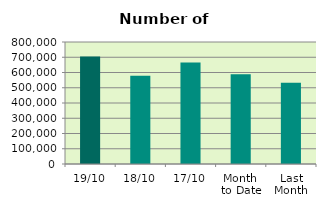
| Category | Series 0 |
|---|---|
| 19/10 | 704824 |
| 18/10 | 577972 |
| 17/10 | 665164 |
| Month 
to Date | 588341.467 |
| Last
Month | 533338.9 |